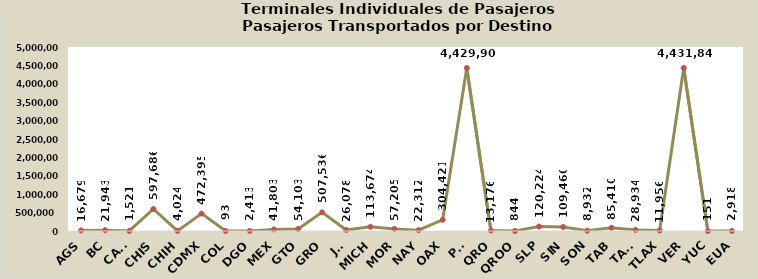
| Category | D e s t i n o s |
|---|---|
| AGS | 16679 |
| BC | 21943 |
| CAMP | 1521 |
| CHIS | 597686 |
| CHIH | 4024 |
| CDMX | 472395 |
| COL | 93 |
| DGO | 2413 |
| MEX | 41803 |
| GTO | 54103 |
| GRO | 507536 |
| JAL | 26078 |
| MICH | 113674 |
| MOR | 57205 |
| NAY | 22312 |
| OAX | 304421 |
| PUE | 4429906 |
| QRO | 13176 |
| QROO | 844 |
| SLP | 120224 |
| SIN | 109460 |
| SON | 8932 |
| TAB | 85410 |
| TAMS | 28934 |
| TLAX | 11956 |
| VER | 4431843 |
| YUC | 151 |
| EUA | 2918 |